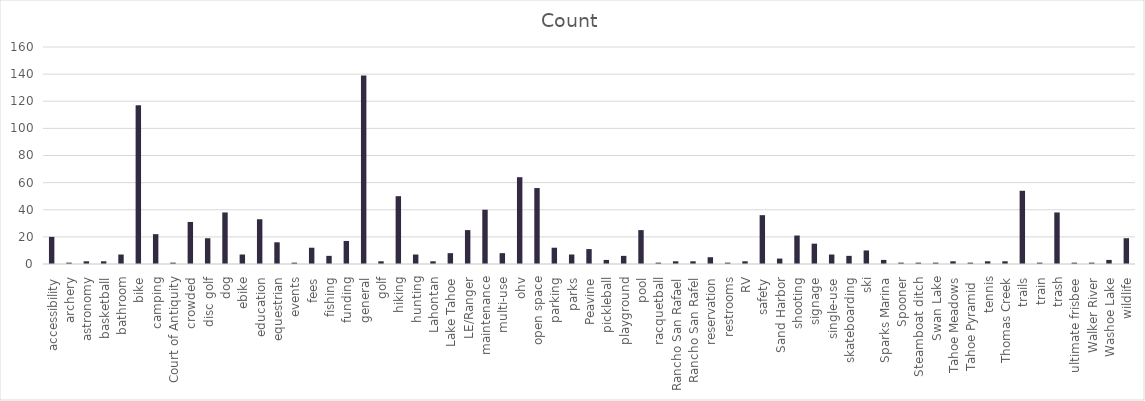
| Category | Count |
|---|---|
| accessibility | 20 |
| archery | 1 |
| astronomy | 2 |
| basketball | 2 |
| bathroom | 7 |
| bike | 117 |
| camping | 22 |
| Court of Antiquity | 1 |
| crowded | 31 |
| disc golf | 19 |
| dog | 38 |
| ebike | 7 |
| education | 33 |
| equestrian | 16 |
| events | 1 |
| fees | 12 |
| fishing | 6 |
| funding | 17 |
| general | 139 |
| golf | 2 |
| hiking | 50 |
| hunting | 7 |
| Lahontan | 2 |
| Lake Tahoe | 8 |
| LE/Ranger | 25 |
| maintenance | 40 |
| multi-use | 8 |
| ohv | 64 |
| open space | 56 |
| parking | 12 |
| parks | 7 |
| Peavine | 11 |
| pickleball | 3 |
| playground | 6 |
| pool | 25 |
| racquetball | 1 |
| Rancho San Rafael | 2 |
| Rancho San Rafel | 2 |
| reservation | 5 |
| restrooms | 1 |
| RV | 2 |
| safety | 36 |
| Sand Harbor | 4 |
| shooting | 21 |
| signage | 15 |
| single-use | 7 |
| skateboarding | 6 |
| ski | 10 |
| Sparks Marina | 3 |
| Spooner | 1 |
| Steamboat ditch | 1 |
| Swan Lake | 1 |
| Tahoe Meadows | 2 |
| Tahoe Pyramid  | 1 |
| tennis | 2 |
| Thomas Creek | 2 |
| trails | 54 |
| train | 1 |
| trash | 38 |
| ultimate frisbee | 1 |
| Walker River | 1 |
| Washoe Lake | 3 |
| wildlife | 19 |